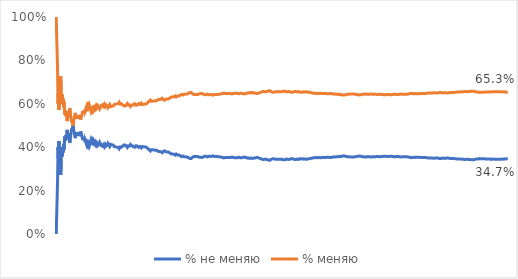
| Category | % не меняю | % меняю |
|---|---|---|
| 0 | 0 | 1 |
| 1 | 0 | 1 |
| 2 | 0 | 1 |
| 3 | 0.25 | 0.75 |
| 4 | 0.4 | 0.6 |
| 5 | 0.333 | 0.667 |
| 6 | 0.429 | 0.571 |
| 7 | 0.375 | 0.625 |
| 8 | 0.333 | 0.667 |
| 9 | 0.3 | 0.7 |
| 10 | 0.273 | 0.727 |
| 11 | 0.333 | 0.667 |
| 12 | 0.385 | 0.615 |
| 13 | 0.357 | 0.643 |
| 14 | 0.4 | 0.6 |
| 15 | 0.375 | 0.625 |
| 16 | 0.412 | 0.588 |
| 17 | 0.389 | 0.611 |
| 18 | 0.421 | 0.579 |
| 19 | 0.45 | 0.55 |
| 20 | 0.429 | 0.571 |
| 21 | 0.455 | 0.545 |
| 22 | 0.435 | 0.565 |
| 23 | 0.458 | 0.542 |
| 24 | 0.48 | 0.52 |
| 25 | 0.462 | 0.538 |
| 26 | 0.444 | 0.556 |
| 27 | 0.464 | 0.536 |
| 28 | 0.448 | 0.552 |
| 29 | 0.433 | 0.567 |
| 30 | 0.419 | 0.581 |
| 31 | 0.438 | 0.562 |
| 32 | 0.455 | 0.545 |
| 33 | 0.471 | 0.529 |
| 34 | 0.486 | 0.514 |
| 35 | 0.472 | 0.528 |
| 36 | 0.486 | 0.514 |
| 37 | 0.5 | 0.5 |
| 38 | 0.487 | 0.513 |
| 39 | 0.475 | 0.525 |
| 40 | 0.463 | 0.537 |
| 41 | 0.452 | 0.548 |
| 42 | 0.442 | 0.558 |
| 43 | 0.455 | 0.545 |
| 44 | 0.467 | 0.533 |
| 45 | 0.457 | 0.543 |
| 46 | 0.468 | 0.532 |
| 47 | 0.458 | 0.542 |
| 48 | 0.469 | 0.531 |
| 49 | 0.46 | 0.54 |
| 50 | 0.451 | 0.549 |
| 51 | 0.462 | 0.538 |
| 52 | 0.453 | 0.547 |
| 53 | 0.463 | 0.537 |
| 54 | 0.473 | 0.527 |
| 55 | 0.464 | 0.536 |
| 56 | 0.456 | 0.544 |
| 57 | 0.448 | 0.552 |
| 58 | 0.441 | 0.559 |
| 59 | 0.433 | 0.567 |
| 60 | 0.443 | 0.557 |
| 61 | 0.435 | 0.565 |
| 62 | 0.429 | 0.571 |
| 63 | 0.438 | 0.562 |
| 64 | 0.431 | 0.569 |
| 65 | 0.424 | 0.576 |
| 66 | 0.418 | 0.582 |
| 67 | 0.412 | 0.588 |
| 68 | 0.42 | 0.58 |
| 69 | 0.414 | 0.586 |
| 70 | 0.408 | 0.592 |
| 71 | 0.417 | 0.583 |
| 72 | 0.411 | 0.589 |
| 73 | 0.405 | 0.595 |
| 74 | 0.413 | 0.587 |
| 75 | 0.421 | 0.579 |
| 76 | 0.429 | 0.571 |
| 77 | 0.436 | 0.564 |
| 78 | 0.43 | 0.57 |
| 79 | 0.425 | 0.575 |
| 80 | 0.432 | 0.568 |
| 81 | 0.427 | 0.573 |
| 82 | 0.422 | 0.578 |
| 83 | 0.429 | 0.571 |
| 84 | 0.424 | 0.576 |
| 85 | 0.419 | 0.581 |
| 86 | 0.414 | 0.586 |
| 87 | 0.42 | 0.58 |
| 88 | 0.416 | 0.584 |
| 89 | 0.411 | 0.589 |
| 90 | 0.418 | 0.582 |
| 91 | 0.413 | 0.587 |
| 92 | 0.409 | 0.591 |
| 93 | 0.404 | 0.596 |
| 94 | 0.411 | 0.589 |
| 95 | 0.417 | 0.583 |
| 96 | 0.423 | 0.577 |
| 97 | 0.418 | 0.582 |
| 98 | 0.414 | 0.586 |
| 99 | 0.41 | 0.59 |
| 100 | 0.406 | 0.594 |
| 101 | 0.402 | 0.598 |
| 102 | 0.408 | 0.592 |
| 103 | 0.404 | 0.596 |
| 104 | 0.41 | 0.59 |
| 105 | 0.406 | 0.594 |
| 106 | 0.402 | 0.598 |
| 107 | 0.407 | 0.593 |
| 108 | 0.413 | 0.587 |
| 109 | 0.409 | 0.591 |
| 110 | 0.405 | 0.595 |
| 111 | 0.402 | 0.598 |
| 112 | 0.407 | 0.593 |
| 113 | 0.412 | 0.588 |
| 114 | 0.417 | 0.583 |
| 115 | 0.414 | 0.586 |
| 116 | 0.41 | 0.59 |
| 117 | 0.407 | 0.593 |
| 118 | 0.403 | 0.597 |
| 119 | 0.408 | 0.592 |
| 120 | 0.413 | 0.587 |
| 121 | 0.41 | 0.59 |
| 122 | 0.415 | 0.585 |
| 123 | 0.411 | 0.589 |
| 124 | 0.408 | 0.592 |
| 125 | 0.413 | 0.587 |
| 126 | 0.409 | 0.591 |
| 127 | 0.406 | 0.594 |
| 128 | 0.403 | 0.597 |
| 129 | 0.408 | 0.592 |
| 130 | 0.405 | 0.595 |
| 131 | 0.402 | 0.598 |
| 132 | 0.398 | 0.602 |
| 133 | 0.403 | 0.597 |
| 134 | 0.4 | 0.6 |
| 135 | 0.397 | 0.603 |
| 136 | 0.401 | 0.599 |
| 137 | 0.399 | 0.601 |
| 138 | 0.396 | 0.604 |
| 139 | 0.393 | 0.607 |
| 140 | 0.397 | 0.603 |
| 141 | 0.401 | 0.599 |
| 142 | 0.399 | 0.601 |
| 143 | 0.403 | 0.597 |
| 144 | 0.4 | 0.6 |
| 145 | 0.397 | 0.603 |
| 146 | 0.401 | 0.599 |
| 147 | 0.405 | 0.595 |
| 148 | 0.409 | 0.591 |
| 149 | 0.407 | 0.593 |
| 150 | 0.411 | 0.589 |
| 151 | 0.414 | 0.586 |
| 152 | 0.412 | 0.588 |
| 153 | 0.409 | 0.591 |
| 154 | 0.406 | 0.594 |
| 155 | 0.404 | 0.596 |
| 156 | 0.401 | 0.599 |
| 157 | 0.399 | 0.601 |
| 158 | 0.403 | 0.597 |
| 159 | 0.406 | 0.594 |
| 160 | 0.404 | 0.596 |
| 161 | 0.407 | 0.593 |
| 162 | 0.405 | 0.595 |
| 163 | 0.409 | 0.591 |
| 164 | 0.412 | 0.588 |
| 165 | 0.41 | 0.59 |
| 166 | 0.407 | 0.593 |
| 167 | 0.405 | 0.595 |
| 168 | 0.408 | 0.592 |
| 169 | 0.406 | 0.594 |
| 170 | 0.404 | 0.596 |
| 171 | 0.401 | 0.599 |
| 172 | 0.405 | 0.595 |
| 173 | 0.402 | 0.598 |
| 174 | 0.4 | 0.6 |
| 175 | 0.403 | 0.597 |
| 176 | 0.407 | 0.593 |
| 177 | 0.41 | 0.59 |
| 178 | 0.408 | 0.592 |
| 179 | 0.406 | 0.594 |
| 180 | 0.403 | 0.597 |
| 181 | 0.401 | 0.599 |
| 182 | 0.399 | 0.601 |
| 183 | 0.397 | 0.603 |
| 184 | 0.4 | 0.6 |
| 185 | 0.403 | 0.597 |
| 186 | 0.401 | 0.599 |
| 187 | 0.399 | 0.601 |
| 188 | 0.397 | 0.603 |
| 189 | 0.4 | 0.6 |
| 190 | 0.403 | 0.597 |
| 191 | 0.401 | 0.599 |
| 192 | 0.404 | 0.596 |
| 193 | 0.402 | 0.598 |
| 194 | 0.405 | 0.595 |
| 195 | 0.403 | 0.597 |
| 196 | 0.401 | 0.599 |
| 197 | 0.399 | 0.601 |
| 198 | 0.397 | 0.603 |
| 199 | 0.4 | 0.6 |
| 200 | 0.398 | 0.602 |
| 201 | 0.396 | 0.604 |
| 202 | 0.394 | 0.606 |
| 203 | 0.392 | 0.608 |
| 204 | 0.39 | 0.61 |
| 205 | 0.388 | 0.612 |
| 206 | 0.386 | 0.614 |
| 207 | 0.385 | 0.615 |
| 208 | 0.383 | 0.617 |
| 209 | 0.386 | 0.614 |
| 210 | 0.389 | 0.611 |
| 211 | 0.387 | 0.613 |
| 212 | 0.385 | 0.615 |
| 213 | 0.388 | 0.612 |
| 214 | 0.386 | 0.614 |
| 215 | 0.384 | 0.616 |
| 216 | 0.387 | 0.613 |
| 217 | 0.39 | 0.61 |
| 218 | 0.388 | 0.612 |
| 219 | 0.386 | 0.614 |
| 220 | 0.385 | 0.615 |
| 221 | 0.387 | 0.613 |
| 222 | 0.386 | 0.614 |
| 223 | 0.384 | 0.616 |
| 224 | 0.382 | 0.618 |
| 225 | 0.381 | 0.619 |
| 226 | 0.379 | 0.621 |
| 227 | 0.377 | 0.623 |
| 228 | 0.38 | 0.62 |
| 229 | 0.378 | 0.622 |
| 230 | 0.381 | 0.619 |
| 231 | 0.379 | 0.621 |
| 232 | 0.378 | 0.622 |
| 233 | 0.376 | 0.624 |
| 234 | 0.374 | 0.626 |
| 235 | 0.377 | 0.623 |
| 236 | 0.38 | 0.62 |
| 237 | 0.378 | 0.622 |
| 238 | 0.381 | 0.619 |
| 239 | 0.383 | 0.617 |
| 240 | 0.382 | 0.618 |
| 241 | 0.38 | 0.62 |
| 242 | 0.379 | 0.621 |
| 243 | 0.381 | 0.619 |
| 244 | 0.38 | 0.62 |
| 245 | 0.378 | 0.622 |
| 246 | 0.381 | 0.619 |
| 247 | 0.379 | 0.621 |
| 248 | 0.378 | 0.622 |
| 249 | 0.376 | 0.624 |
| 250 | 0.375 | 0.625 |
| 251 | 0.373 | 0.627 |
| 252 | 0.372 | 0.628 |
| 253 | 0.37 | 0.63 |
| 254 | 0.369 | 0.631 |
| 255 | 0.371 | 0.629 |
| 256 | 0.37 | 0.63 |
| 257 | 0.368 | 0.632 |
| 258 | 0.371 | 0.629 |
| 259 | 0.369 | 0.631 |
| 260 | 0.368 | 0.632 |
| 261 | 0.366 | 0.634 |
| 262 | 0.365 | 0.635 |
| 263 | 0.364 | 0.636 |
| 264 | 0.366 | 0.634 |
| 265 | 0.368 | 0.632 |
| 266 | 0.367 | 0.633 |
| 267 | 0.366 | 0.634 |
| 268 | 0.364 | 0.636 |
| 269 | 0.363 | 0.637 |
| 270 | 0.365 | 0.635 |
| 271 | 0.364 | 0.636 |
| 272 | 0.363 | 0.637 |
| 273 | 0.361 | 0.639 |
| 274 | 0.36 | 0.64 |
| 275 | 0.359 | 0.641 |
| 276 | 0.357 | 0.643 |
| 277 | 0.356 | 0.644 |
| 278 | 0.358 | 0.642 |
| 279 | 0.357 | 0.643 |
| 280 | 0.359 | 0.641 |
| 281 | 0.358 | 0.642 |
| 282 | 0.357 | 0.643 |
| 283 | 0.356 | 0.644 |
| 284 | 0.358 | 0.642 |
| 285 | 0.357 | 0.643 |
| 286 | 0.355 | 0.645 |
| 287 | 0.354 | 0.646 |
| 288 | 0.353 | 0.647 |
| 289 | 0.355 | 0.645 |
| 290 | 0.354 | 0.646 |
| 291 | 0.353 | 0.647 |
| 292 | 0.352 | 0.648 |
| 293 | 0.35 | 0.65 |
| 294 | 0.349 | 0.651 |
| 295 | 0.348 | 0.652 |
| 296 | 0.347 | 0.653 |
| 297 | 0.346 | 0.654 |
| 298 | 0.348 | 0.652 |
| 299 | 0.35 | 0.65 |
| 300 | 0.352 | 0.648 |
| 301 | 0.354 | 0.646 |
| 302 | 0.356 | 0.644 |
| 303 | 0.355 | 0.645 |
| 304 | 0.357 | 0.643 |
| 305 | 0.356 | 0.644 |
| 306 | 0.355 | 0.645 |
| 307 | 0.357 | 0.643 |
| 308 | 0.359 | 0.641 |
| 309 | 0.358 | 0.642 |
| 310 | 0.357 | 0.643 |
| 311 | 0.356 | 0.644 |
| 312 | 0.358 | 0.642 |
| 313 | 0.357 | 0.643 |
| 314 | 0.356 | 0.644 |
| 315 | 0.354 | 0.646 |
| 316 | 0.353 | 0.647 |
| 317 | 0.352 | 0.648 |
| 318 | 0.351 | 0.649 |
| 319 | 0.353 | 0.647 |
| 320 | 0.352 | 0.648 |
| 321 | 0.351 | 0.649 |
| 322 | 0.353 | 0.647 |
| 323 | 0.352 | 0.648 |
| 324 | 0.354 | 0.646 |
| 325 | 0.356 | 0.644 |
| 326 | 0.358 | 0.642 |
| 327 | 0.36 | 0.64 |
| 328 | 0.359 | 0.641 |
| 329 | 0.358 | 0.642 |
| 330 | 0.356 | 0.644 |
| 331 | 0.358 | 0.642 |
| 332 | 0.357 | 0.643 |
| 333 | 0.356 | 0.644 |
| 334 | 0.355 | 0.645 |
| 335 | 0.357 | 0.643 |
| 336 | 0.359 | 0.641 |
| 337 | 0.358 | 0.642 |
| 338 | 0.357 | 0.643 |
| 339 | 0.356 | 0.644 |
| 340 | 0.358 | 0.642 |
| 341 | 0.36 | 0.64 |
| 342 | 0.359 | 0.641 |
| 343 | 0.358 | 0.642 |
| 344 | 0.359 | 0.641 |
| 345 | 0.358 | 0.642 |
| 346 | 0.36 | 0.64 |
| 347 | 0.359 | 0.641 |
| 348 | 0.358 | 0.642 |
| 349 | 0.357 | 0.643 |
| 350 | 0.356 | 0.644 |
| 351 | 0.358 | 0.642 |
| 352 | 0.357 | 0.643 |
| 353 | 0.359 | 0.641 |
| 354 | 0.358 | 0.642 |
| 355 | 0.357 | 0.643 |
| 356 | 0.356 | 0.644 |
| 357 | 0.355 | 0.645 |
| 358 | 0.357 | 0.643 |
| 359 | 0.356 | 0.644 |
| 360 | 0.355 | 0.645 |
| 361 | 0.356 | 0.644 |
| 362 | 0.355 | 0.645 |
| 363 | 0.354 | 0.646 |
| 364 | 0.353 | 0.647 |
| 365 | 0.352 | 0.648 |
| 366 | 0.354 | 0.646 |
| 367 | 0.353 | 0.647 |
| 368 | 0.352 | 0.648 |
| 369 | 0.351 | 0.649 |
| 370 | 0.35 | 0.65 |
| 371 | 0.349 | 0.651 |
| 372 | 0.351 | 0.649 |
| 373 | 0.353 | 0.647 |
| 374 | 0.352 | 0.648 |
| 375 | 0.351 | 0.649 |
| 376 | 0.353 | 0.647 |
| 377 | 0.354 | 0.646 |
| 378 | 0.354 | 0.646 |
| 379 | 0.353 | 0.647 |
| 380 | 0.352 | 0.648 |
| 381 | 0.353 | 0.647 |
| 382 | 0.352 | 0.648 |
| 383 | 0.352 | 0.648 |
| 384 | 0.353 | 0.647 |
| 385 | 0.352 | 0.648 |
| 386 | 0.351 | 0.649 |
| 387 | 0.353 | 0.647 |
| 388 | 0.355 | 0.645 |
| 389 | 0.354 | 0.646 |
| 390 | 0.353 | 0.647 |
| 391 | 0.352 | 0.648 |
| 392 | 0.351 | 0.649 |
| 393 | 0.353 | 0.647 |
| 394 | 0.352 | 0.648 |
| 395 | 0.351 | 0.649 |
| 396 | 0.353 | 0.647 |
| 397 | 0.352 | 0.648 |
| 398 | 0.353 | 0.647 |
| 399 | 0.352 | 0.648 |
| 400 | 0.352 | 0.648 |
| 401 | 0.353 | 0.647 |
| 402 | 0.355 | 0.645 |
| 403 | 0.354 | 0.646 |
| 404 | 0.353 | 0.647 |
| 405 | 0.352 | 0.648 |
| 406 | 0.351 | 0.649 |
| 407 | 0.35 | 0.65 |
| 408 | 0.35 | 0.65 |
| 409 | 0.351 | 0.649 |
| 410 | 0.353 | 0.647 |
| 411 | 0.354 | 0.646 |
| 412 | 0.354 | 0.646 |
| 413 | 0.355 | 0.645 |
| 414 | 0.354 | 0.646 |
| 415 | 0.353 | 0.647 |
| 416 | 0.355 | 0.645 |
| 417 | 0.354 | 0.646 |
| 418 | 0.353 | 0.647 |
| 419 | 0.352 | 0.648 |
| 420 | 0.352 | 0.648 |
| 421 | 0.351 | 0.649 |
| 422 | 0.352 | 0.648 |
| 423 | 0.351 | 0.649 |
| 424 | 0.351 | 0.649 |
| 425 | 0.35 | 0.65 |
| 426 | 0.349 | 0.651 |
| 427 | 0.348 | 0.652 |
| 428 | 0.347 | 0.653 |
| 429 | 0.349 | 0.651 |
| 430 | 0.35 | 0.65 |
| 431 | 0.35 | 0.65 |
| 432 | 0.349 | 0.651 |
| 433 | 0.348 | 0.652 |
| 434 | 0.347 | 0.653 |
| 435 | 0.349 | 0.651 |
| 436 | 0.35 | 0.65 |
| 437 | 0.349 | 0.651 |
| 438 | 0.349 | 0.651 |
| 439 | 0.35 | 0.65 |
| 440 | 0.351 | 0.649 |
| 441 | 0.353 | 0.647 |
| 442 | 0.352 | 0.648 |
| 443 | 0.351 | 0.649 |
| 444 | 0.351 | 0.649 |
| 445 | 0.352 | 0.648 |
| 446 | 0.351 | 0.649 |
| 447 | 0.35 | 0.65 |
| 448 | 0.35 | 0.65 |
| 449 | 0.349 | 0.651 |
| 450 | 0.348 | 0.652 |
| 451 | 0.347 | 0.653 |
| 452 | 0.347 | 0.653 |
| 453 | 0.346 | 0.654 |
| 454 | 0.345 | 0.655 |
| 455 | 0.344 | 0.656 |
| 456 | 0.344 | 0.656 |
| 457 | 0.343 | 0.657 |
| 458 | 0.344 | 0.656 |
| 459 | 0.346 | 0.654 |
| 460 | 0.345 | 0.655 |
| 461 | 0.344 | 0.656 |
| 462 | 0.346 | 0.654 |
| 463 | 0.345 | 0.655 |
| 464 | 0.344 | 0.656 |
| 465 | 0.343 | 0.657 |
| 466 | 0.343 | 0.657 |
| 467 | 0.342 | 0.658 |
| 468 | 0.341 | 0.659 |
| 469 | 0.34 | 0.66 |
| 470 | 0.34 | 0.66 |
| 471 | 0.339 | 0.661 |
| 472 | 0.34 | 0.66 |
| 473 | 0.342 | 0.658 |
| 474 | 0.343 | 0.657 |
| 475 | 0.345 | 0.655 |
| 476 | 0.346 | 0.654 |
| 477 | 0.345 | 0.655 |
| 478 | 0.347 | 0.653 |
| 479 | 0.348 | 0.652 |
| 480 | 0.347 | 0.653 |
| 481 | 0.346 | 0.654 |
| 482 | 0.346 | 0.654 |
| 483 | 0.345 | 0.655 |
| 484 | 0.344 | 0.656 |
| 485 | 0.344 | 0.656 |
| 486 | 0.345 | 0.655 |
| 487 | 0.344 | 0.656 |
| 488 | 0.346 | 0.654 |
| 489 | 0.345 | 0.655 |
| 490 | 0.344 | 0.656 |
| 491 | 0.343 | 0.657 |
| 492 | 0.343 | 0.657 |
| 493 | 0.344 | 0.656 |
| 494 | 0.343 | 0.657 |
| 495 | 0.345 | 0.655 |
| 496 | 0.344 | 0.656 |
| 497 | 0.345 | 0.655 |
| 498 | 0.345 | 0.655 |
| 499 | 0.344 | 0.656 |
| 500 | 0.343 | 0.657 |
| 501 | 0.343 | 0.657 |
| 502 | 0.342 | 0.658 |
| 503 | 0.341 | 0.659 |
| 504 | 0.343 | 0.657 |
| 505 | 0.342 | 0.658 |
| 506 | 0.343 | 0.657 |
| 507 | 0.344 | 0.656 |
| 508 | 0.346 | 0.654 |
| 509 | 0.345 | 0.655 |
| 510 | 0.344 | 0.656 |
| 511 | 0.344 | 0.656 |
| 512 | 0.345 | 0.655 |
| 513 | 0.344 | 0.656 |
| 514 | 0.344 | 0.656 |
| 515 | 0.345 | 0.655 |
| 516 | 0.344 | 0.656 |
| 517 | 0.346 | 0.654 |
| 518 | 0.345 | 0.655 |
| 519 | 0.346 | 0.654 |
| 520 | 0.347 | 0.653 |
| 521 | 0.347 | 0.653 |
| 522 | 0.346 | 0.654 |
| 523 | 0.345 | 0.655 |
| 524 | 0.345 | 0.655 |
| 525 | 0.344 | 0.656 |
| 526 | 0.343 | 0.657 |
| 527 | 0.345 | 0.655 |
| 528 | 0.344 | 0.656 |
| 529 | 0.343 | 0.657 |
| 530 | 0.345 | 0.655 |
| 531 | 0.344 | 0.656 |
| 532 | 0.345 | 0.655 |
| 533 | 0.345 | 0.655 |
| 534 | 0.344 | 0.656 |
| 535 | 0.343 | 0.657 |
| 536 | 0.345 | 0.655 |
| 537 | 0.346 | 0.654 |
| 538 | 0.347 | 0.653 |
| 539 | 0.346 | 0.654 |
| 540 | 0.348 | 0.652 |
| 541 | 0.347 | 0.653 |
| 542 | 0.346 | 0.654 |
| 543 | 0.346 | 0.654 |
| 544 | 0.345 | 0.655 |
| 545 | 0.344 | 0.656 |
| 546 | 0.346 | 0.654 |
| 547 | 0.347 | 0.653 |
| 548 | 0.346 | 0.654 |
| 549 | 0.345 | 0.655 |
| 550 | 0.345 | 0.655 |
| 551 | 0.344 | 0.656 |
| 552 | 0.344 | 0.656 |
| 553 | 0.345 | 0.655 |
| 554 | 0.346 | 0.654 |
| 555 | 0.345 | 0.655 |
| 556 | 0.346 | 0.654 |
| 557 | 0.346 | 0.654 |
| 558 | 0.347 | 0.653 |
| 559 | 0.346 | 0.654 |
| 560 | 0.348 | 0.652 |
| 561 | 0.347 | 0.653 |
| 562 | 0.348 | 0.652 |
| 563 | 0.348 | 0.652 |
| 564 | 0.349 | 0.651 |
| 565 | 0.35 | 0.65 |
| 566 | 0.351 | 0.649 |
| 567 | 0.35 | 0.65 |
| 568 | 0.351 | 0.649 |
| 569 | 0.353 | 0.647 |
| 570 | 0.352 | 0.648 |
| 571 | 0.351 | 0.649 |
| 572 | 0.351 | 0.649 |
| 573 | 0.352 | 0.648 |
| 574 | 0.353 | 0.647 |
| 575 | 0.352 | 0.648 |
| 576 | 0.352 | 0.648 |
| 577 | 0.351 | 0.649 |
| 578 | 0.352 | 0.648 |
| 579 | 0.352 | 0.648 |
| 580 | 0.353 | 0.647 |
| 581 | 0.352 | 0.648 |
| 582 | 0.352 | 0.648 |
| 583 | 0.351 | 0.649 |
| 584 | 0.352 | 0.648 |
| 585 | 0.352 | 0.648 |
| 586 | 0.353 | 0.647 |
| 587 | 0.352 | 0.648 |
| 588 | 0.353 | 0.647 |
| 589 | 0.353 | 0.647 |
| 590 | 0.352 | 0.648 |
| 591 | 0.351 | 0.649 |
| 592 | 0.352 | 0.648 |
| 593 | 0.354 | 0.646 |
| 594 | 0.353 | 0.647 |
| 595 | 0.352 | 0.648 |
| 596 | 0.353 | 0.647 |
| 597 | 0.355 | 0.645 |
| 598 | 0.354 | 0.646 |
| 599 | 0.353 | 0.647 |
| 600 | 0.354 | 0.646 |
| 601 | 0.354 | 0.646 |
| 602 | 0.353 | 0.647 |
| 603 | 0.353 | 0.647 |
| 604 | 0.352 | 0.648 |
| 605 | 0.351 | 0.649 |
| 606 | 0.353 | 0.647 |
| 607 | 0.352 | 0.648 |
| 608 | 0.353 | 0.647 |
| 609 | 0.354 | 0.646 |
| 610 | 0.355 | 0.645 |
| 611 | 0.355 | 0.645 |
| 612 | 0.356 | 0.644 |
| 613 | 0.355 | 0.645 |
| 614 | 0.354 | 0.646 |
| 615 | 0.354 | 0.646 |
| 616 | 0.355 | 0.645 |
| 617 | 0.356 | 0.644 |
| 618 | 0.357 | 0.643 |
| 619 | 0.356 | 0.644 |
| 620 | 0.356 | 0.644 |
| 621 | 0.357 | 0.643 |
| 622 | 0.356 | 0.644 |
| 623 | 0.357 | 0.643 |
| 624 | 0.357 | 0.643 |
| 625 | 0.358 | 0.642 |
| 626 | 0.357 | 0.643 |
| 627 | 0.357 | 0.643 |
| 628 | 0.356 | 0.644 |
| 629 | 0.357 | 0.643 |
| 630 | 0.358 | 0.642 |
| 631 | 0.359 | 0.641 |
| 632 | 0.359 | 0.641 |
| 633 | 0.36 | 0.64 |
| 634 | 0.359 | 0.641 |
| 635 | 0.358 | 0.642 |
| 636 | 0.359 | 0.641 |
| 637 | 0.359 | 0.641 |
| 638 | 0.358 | 0.642 |
| 639 | 0.358 | 0.642 |
| 640 | 0.357 | 0.643 |
| 641 | 0.357 | 0.643 |
| 642 | 0.356 | 0.644 |
| 643 | 0.356 | 0.644 |
| 644 | 0.355 | 0.645 |
| 645 | 0.356 | 0.644 |
| 646 | 0.355 | 0.645 |
| 647 | 0.355 | 0.645 |
| 648 | 0.354 | 0.646 |
| 649 | 0.355 | 0.645 |
| 650 | 0.355 | 0.645 |
| 651 | 0.356 | 0.644 |
| 652 | 0.355 | 0.645 |
| 653 | 0.356 | 0.644 |
| 654 | 0.356 | 0.644 |
| 655 | 0.355 | 0.645 |
| 656 | 0.356 | 0.644 |
| 657 | 0.356 | 0.644 |
| 658 | 0.355 | 0.645 |
| 659 | 0.355 | 0.645 |
| 660 | 0.356 | 0.644 |
| 661 | 0.356 | 0.644 |
| 662 | 0.357 | 0.643 |
| 663 | 0.357 | 0.643 |
| 664 | 0.358 | 0.642 |
| 665 | 0.357 | 0.643 |
| 666 | 0.357 | 0.643 |
| 667 | 0.358 | 0.642 |
| 668 | 0.357 | 0.643 |
| 669 | 0.358 | 0.642 |
| 670 | 0.359 | 0.641 |
| 671 | 0.359 | 0.641 |
| 672 | 0.358 | 0.642 |
| 673 | 0.358 | 0.642 |
| 674 | 0.357 | 0.643 |
| 675 | 0.357 | 0.643 |
| 676 | 0.356 | 0.644 |
| 677 | 0.357 | 0.643 |
| 678 | 0.356 | 0.644 |
| 679 | 0.356 | 0.644 |
| 680 | 0.355 | 0.645 |
| 681 | 0.355 | 0.645 |
| 682 | 0.354 | 0.646 |
| 683 | 0.355 | 0.645 |
| 684 | 0.356 | 0.644 |
| 685 | 0.356 | 0.644 |
| 686 | 0.355 | 0.645 |
| 687 | 0.355 | 0.645 |
| 688 | 0.356 | 0.644 |
| 689 | 0.357 | 0.643 |
| 690 | 0.356 | 0.644 |
| 691 | 0.355 | 0.645 |
| 692 | 0.355 | 0.645 |
| 693 | 0.356 | 0.644 |
| 694 | 0.355 | 0.645 |
| 695 | 0.356 | 0.644 |
| 696 | 0.356 | 0.644 |
| 697 | 0.355 | 0.645 |
| 698 | 0.356 | 0.644 |
| 699 | 0.356 | 0.644 |
| 700 | 0.357 | 0.643 |
| 701 | 0.356 | 0.644 |
| 702 | 0.356 | 0.644 |
| 703 | 0.355 | 0.645 |
| 704 | 0.356 | 0.644 |
| 705 | 0.356 | 0.644 |
| 706 | 0.356 | 0.644 |
| 707 | 0.356 | 0.644 |
| 708 | 0.357 | 0.643 |
| 709 | 0.358 | 0.642 |
| 710 | 0.357 | 0.643 |
| 711 | 0.357 | 0.643 |
| 712 | 0.356 | 0.644 |
| 713 | 0.356 | 0.644 |
| 714 | 0.355 | 0.645 |
| 715 | 0.356 | 0.644 |
| 716 | 0.356 | 0.644 |
| 717 | 0.357 | 0.643 |
| 718 | 0.357 | 0.643 |
| 719 | 0.358 | 0.642 |
| 720 | 0.358 | 0.642 |
| 721 | 0.357 | 0.643 |
| 722 | 0.358 | 0.642 |
| 723 | 0.358 | 0.642 |
| 724 | 0.359 | 0.641 |
| 725 | 0.36 | 0.64 |
| 726 | 0.359 | 0.641 |
| 727 | 0.359 | 0.641 |
| 728 | 0.358 | 0.642 |
| 729 | 0.358 | 0.642 |
| 730 | 0.357 | 0.643 |
| 731 | 0.357 | 0.643 |
| 732 | 0.357 | 0.643 |
| 733 | 0.357 | 0.643 |
| 734 | 0.356 | 0.644 |
| 735 | 0.357 | 0.643 |
| 736 | 0.358 | 0.642 |
| 737 | 0.358 | 0.642 |
| 738 | 0.357 | 0.643 |
| 739 | 0.358 | 0.642 |
| 740 | 0.358 | 0.642 |
| 741 | 0.357 | 0.643 |
| 742 | 0.357 | 0.643 |
| 743 | 0.358 | 0.642 |
| 744 | 0.357 | 0.643 |
| 745 | 0.357 | 0.643 |
| 746 | 0.356 | 0.644 |
| 747 | 0.356 | 0.644 |
| 748 | 0.355 | 0.645 |
| 749 | 0.356 | 0.644 |
| 750 | 0.357 | 0.643 |
| 751 | 0.358 | 0.642 |
| 752 | 0.357 | 0.643 |
| 753 | 0.358 | 0.642 |
| 754 | 0.358 | 0.642 |
| 755 | 0.357 | 0.643 |
| 756 | 0.357 | 0.643 |
| 757 | 0.356 | 0.644 |
| 758 | 0.356 | 0.644 |
| 759 | 0.355 | 0.645 |
| 760 | 0.355 | 0.645 |
| 761 | 0.356 | 0.644 |
| 762 | 0.356 | 0.644 |
| 763 | 0.356 | 0.644 |
| 764 | 0.356 | 0.644 |
| 765 | 0.356 | 0.644 |
| 766 | 0.356 | 0.644 |
| 767 | 0.355 | 0.645 |
| 768 | 0.355 | 0.645 |
| 769 | 0.356 | 0.644 |
| 770 | 0.355 | 0.645 |
| 771 | 0.355 | 0.645 |
| 772 | 0.356 | 0.644 |
| 773 | 0.355 | 0.645 |
| 774 | 0.356 | 0.644 |
| 775 | 0.356 | 0.644 |
| 776 | 0.355 | 0.645 |
| 777 | 0.355 | 0.645 |
| 778 | 0.354 | 0.646 |
| 779 | 0.354 | 0.646 |
| 780 | 0.353 | 0.647 |
| 781 | 0.353 | 0.647 |
| 782 | 0.352 | 0.648 |
| 783 | 0.352 | 0.648 |
| 784 | 0.352 | 0.648 |
| 785 | 0.352 | 0.648 |
| 786 | 0.353 | 0.647 |
| 787 | 0.353 | 0.647 |
| 788 | 0.354 | 0.646 |
| 789 | 0.353 | 0.647 |
| 790 | 0.354 | 0.646 |
| 791 | 0.354 | 0.646 |
| 792 | 0.353 | 0.647 |
| 793 | 0.353 | 0.647 |
| 794 | 0.352 | 0.648 |
| 795 | 0.353 | 0.647 |
| 796 | 0.354 | 0.646 |
| 797 | 0.353 | 0.647 |
| 798 | 0.353 | 0.647 |
| 799 | 0.354 | 0.646 |
| 800 | 0.353 | 0.647 |
| 801 | 0.353 | 0.647 |
| 802 | 0.352 | 0.648 |
| 803 | 0.353 | 0.647 |
| 804 | 0.353 | 0.647 |
| 805 | 0.354 | 0.646 |
| 806 | 0.353 | 0.647 |
| 807 | 0.353 | 0.647 |
| 808 | 0.352 | 0.648 |
| 809 | 0.353 | 0.647 |
| 810 | 0.353 | 0.647 |
| 811 | 0.352 | 0.648 |
| 812 | 0.352 | 0.648 |
| 813 | 0.353 | 0.647 |
| 814 | 0.352 | 0.648 |
| 815 | 0.352 | 0.648 |
| 816 | 0.351 | 0.649 |
| 817 | 0.352 | 0.648 |
| 818 | 0.352 | 0.648 |
| 819 | 0.351 | 0.649 |
| 820 | 0.351 | 0.649 |
| 821 | 0.352 | 0.648 |
| 822 | 0.351 | 0.649 |
| 823 | 0.351 | 0.649 |
| 824 | 0.352 | 0.648 |
| 825 | 0.351 | 0.649 |
| 826 | 0.351 | 0.649 |
| 827 | 0.351 | 0.649 |
| 828 | 0.351 | 0.649 |
| 829 | 0.351 | 0.649 |
| 830 | 0.35 | 0.65 |
| 831 | 0.35 | 0.65 |
| 832 | 0.349 | 0.651 |
| 833 | 0.35 | 0.65 |
| 834 | 0.35 | 0.65 |
| 835 | 0.349 | 0.651 |
| 836 | 0.35 | 0.65 |
| 837 | 0.351 | 0.649 |
| 838 | 0.35 | 0.65 |
| 839 | 0.35 | 0.65 |
| 840 | 0.351 | 0.649 |
| 841 | 0.35 | 0.65 |
| 842 | 0.35 | 0.65 |
| 843 | 0.35 | 0.65 |
| 844 | 0.349 | 0.651 |
| 845 | 0.349 | 0.651 |
| 846 | 0.348 | 0.652 |
| 847 | 0.348 | 0.652 |
| 848 | 0.347 | 0.653 |
| 849 | 0.348 | 0.652 |
| 850 | 0.348 | 0.652 |
| 851 | 0.349 | 0.651 |
| 852 | 0.349 | 0.651 |
| 853 | 0.35 | 0.65 |
| 854 | 0.35 | 0.65 |
| 855 | 0.349 | 0.651 |
| 856 | 0.349 | 0.651 |
| 857 | 0.35 | 0.65 |
| 858 | 0.349 | 0.651 |
| 859 | 0.349 | 0.651 |
| 860 | 0.348 | 0.652 |
| 861 | 0.349 | 0.651 |
| 862 | 0.35 | 0.65 |
| 863 | 0.351 | 0.649 |
| 864 | 0.35 | 0.65 |
| 865 | 0.35 | 0.65 |
| 866 | 0.349 | 0.651 |
| 867 | 0.349 | 0.651 |
| 868 | 0.349 | 0.651 |
| 869 | 0.348 | 0.652 |
| 870 | 0.348 | 0.652 |
| 871 | 0.347 | 0.653 |
| 872 | 0.348 | 0.652 |
| 873 | 0.348 | 0.652 |
| 874 | 0.347 | 0.653 |
| 875 | 0.348 | 0.652 |
| 876 | 0.348 | 0.652 |
| 877 | 0.347 | 0.653 |
| 878 | 0.348 | 0.652 |
| 879 | 0.348 | 0.652 |
| 880 | 0.347 | 0.653 |
| 881 | 0.347 | 0.653 |
| 882 | 0.347 | 0.653 |
| 883 | 0.346 | 0.654 |
| 884 | 0.346 | 0.654 |
| 885 | 0.347 | 0.653 |
| 886 | 0.346 | 0.654 |
| 887 | 0.346 | 0.654 |
| 888 | 0.345 | 0.655 |
| 889 | 0.346 | 0.654 |
| 890 | 0.347 | 0.653 |
| 891 | 0.346 | 0.654 |
| 892 | 0.346 | 0.654 |
| 893 | 0.346 | 0.654 |
| 894 | 0.345 | 0.655 |
| 895 | 0.345 | 0.655 |
| 896 | 0.344 | 0.656 |
| 897 | 0.344 | 0.656 |
| 898 | 0.345 | 0.655 |
| 899 | 0.344 | 0.656 |
| 900 | 0.344 | 0.656 |
| 901 | 0.344 | 0.656 |
| 902 | 0.344 | 0.656 |
| 903 | 0.344 | 0.656 |
| 904 | 0.344 | 0.656 |
| 905 | 0.343 | 0.657 |
| 906 | 0.344 | 0.656 |
| 907 | 0.345 | 0.655 |
| 908 | 0.344 | 0.656 |
| 909 | 0.344 | 0.656 |
| 910 | 0.344 | 0.656 |
| 911 | 0.343 | 0.657 |
| 912 | 0.344 | 0.656 |
| 913 | 0.344 | 0.656 |
| 914 | 0.343 | 0.657 |
| 915 | 0.343 | 0.657 |
| 916 | 0.342 | 0.658 |
| 917 | 0.342 | 0.658 |
| 918 | 0.342 | 0.658 |
| 919 | 0.342 | 0.658 |
| 920 | 0.342 | 0.658 |
| 921 | 0.342 | 0.658 |
| 922 | 0.342 | 0.658 |
| 923 | 0.343 | 0.657 |
| 924 | 0.344 | 0.656 |
| 925 | 0.344 | 0.656 |
| 926 | 0.345 | 0.655 |
| 927 | 0.345 | 0.655 |
| 928 | 0.346 | 0.654 |
| 929 | 0.345 | 0.655 |
| 930 | 0.345 | 0.655 |
| 931 | 0.345 | 0.655 |
| 932 | 0.346 | 0.654 |
| 933 | 0.347 | 0.653 |
| 934 | 0.348 | 0.652 |
| 935 | 0.347 | 0.653 |
| 936 | 0.347 | 0.653 |
| 937 | 0.346 | 0.654 |
| 938 | 0.346 | 0.654 |
| 939 | 0.346 | 0.654 |
| 940 | 0.346 | 0.654 |
| 941 | 0.346 | 0.654 |
| 942 | 0.346 | 0.654 |
| 943 | 0.346 | 0.654 |
| 944 | 0.346 | 0.654 |
| 945 | 0.347 | 0.653 |
| 946 | 0.346 | 0.654 |
| 947 | 0.346 | 0.654 |
| 948 | 0.346 | 0.654 |
| 949 | 0.345 | 0.655 |
| 950 | 0.345 | 0.655 |
| 951 | 0.345 | 0.655 |
| 952 | 0.345 | 0.655 |
| 953 | 0.345 | 0.655 |
| 954 | 0.346 | 0.654 |
| 955 | 0.345 | 0.655 |
| 956 | 0.345 | 0.655 |
| 957 | 0.344 | 0.656 |
| 958 | 0.345 | 0.655 |
| 959 | 0.345 | 0.655 |
| 960 | 0.344 | 0.656 |
| 961 | 0.344 | 0.656 |
| 962 | 0.345 | 0.655 |
| 963 | 0.344 | 0.656 |
| 964 | 0.345 | 0.655 |
| 965 | 0.346 | 0.654 |
| 966 | 0.345 | 0.655 |
| 967 | 0.345 | 0.655 |
| 968 | 0.346 | 0.654 |
| 969 | 0.345 | 0.655 |
| 970 | 0.345 | 0.655 |
| 971 | 0.345 | 0.655 |
| 972 | 0.345 | 0.655 |
| 973 | 0.345 | 0.655 |
| 974 | 0.346 | 0.654 |
| 975 | 0.345 | 0.655 |
| 976 | 0.345 | 0.655 |
| 977 | 0.346 | 0.654 |
| 978 | 0.345 | 0.655 |
| 979 | 0.345 | 0.655 |
| 980 | 0.345 | 0.655 |
| 981 | 0.344 | 0.656 |
| 982 | 0.344 | 0.656 |
| 983 | 0.345 | 0.655 |
| 984 | 0.345 | 0.655 |
| 985 | 0.346 | 0.654 |
| 986 | 0.345 | 0.655 |
| 987 | 0.345 | 0.655 |
| 988 | 0.345 | 0.655 |
| 989 | 0.345 | 0.655 |
| 990 | 0.346 | 0.654 |
| 991 | 0.346 | 0.654 |
| 992 | 0.345 | 0.655 |
| 993 | 0.346 | 0.654 |
| 994 | 0.347 | 0.653 |
| 995 | 0.346 | 0.654 |
| 996 | 0.347 | 0.653 |
| 997 | 0.347 | 0.653 |
| 998 | 0.347 | 0.653 |
| 999 | 0.347 | 0.653 |